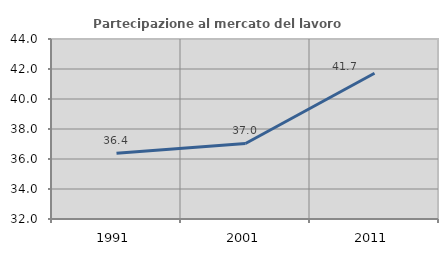
| Category | Partecipazione al mercato del lavoro  femminile |
|---|---|
| 1991.0 | 36.387 |
| 2001.0 | 37.037 |
| 2011.0 | 41.714 |